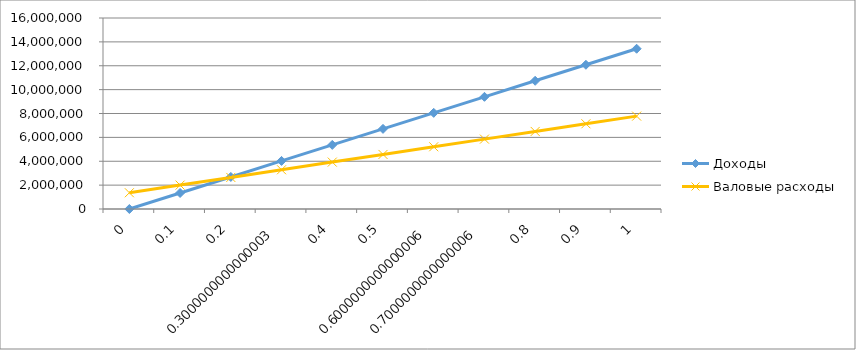
| Category | Доходы | Валовые расходы |
|---|---|---|
| 0 | 0 | 1360425.4 |
| 1 | 1342452.5 | 2002467.9 |
| 2 | 2684905 | 2644510.4 |
| 3 | 4027357.5 | 3286552.9 |
| 4 | 5369810 | 3928595.4 |
| 5 | 6712262.5 | 4570637.9 |
| 6 | 8054715 | 5212680.4 |
| 7 | 9397167.5 | 5854722.9 |
| 8 | 10739620 | 6496765.4 |
| 9 | 12082072.5 | 7138807.9 |
| 10 | 13424525 | 7780850.4 |